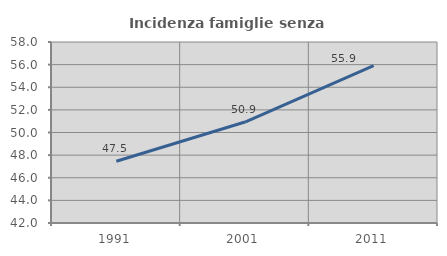
| Category | Incidenza famiglie senza nuclei |
|---|---|
| 1991.0 | 47.458 |
| 2001.0 | 50.926 |
| 2011.0 | 55.914 |